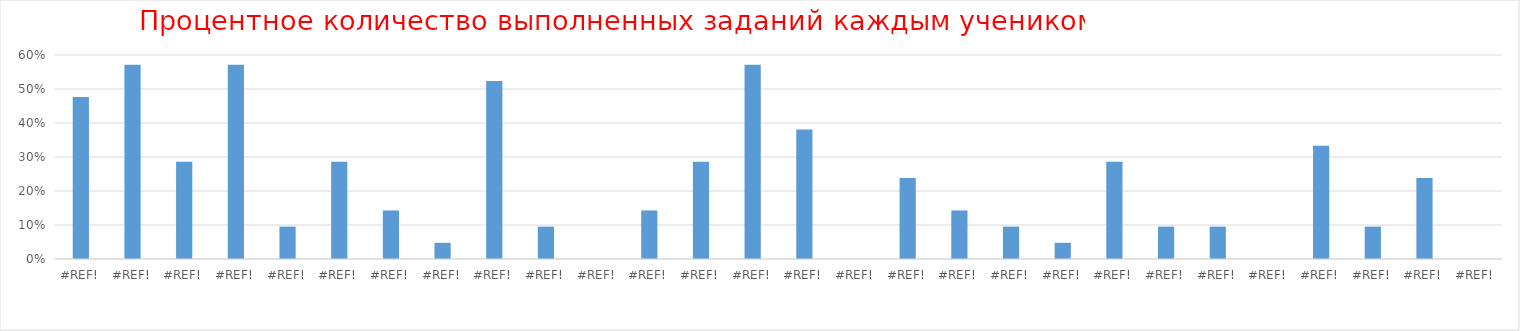
| Category | Series 0 |
|---|---|
| 0.0 | 0.476 |
| 0.0 | 0.571 |
| 0.0 | 0.286 |
| 0.0 | 0.571 |
| 0.0 | 0.095 |
| 0.0 | 0.286 |
| 0.0 | 0.143 |
| 0.0 | 0.048 |
| 0.0 | 0.524 |
| 0.0 | 0.095 |
| 0.0 | 0 |
| 0.0 | 0.143 |
| 0.0 | 0.286 |
| 0.0 | 0.571 |
| 0.0 | 0.381 |
| 0.0 | 0 |
| 0.0 | 0.238 |
| 0.0 | 0.143 |
| 0.0 | 0.095 |
| 0.0 | 0.048 |
| 0.0 | 0.286 |
| 0.0 | 0.095 |
| 0.0 | 0.095 |
| 0.0 | 0 |
| 0.0 | 0.333 |
| 0.0 | 0.095 |
| 0.0 | 0.238 |
| 0.0 | 0 |